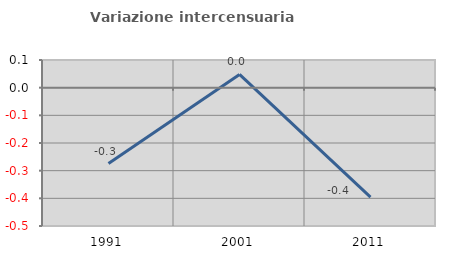
| Category | Variazione intercensuaria annua |
|---|---|
| 1991.0 | -0.274 |
| 2001.0 | 0.048 |
| 2011.0 | -0.396 |